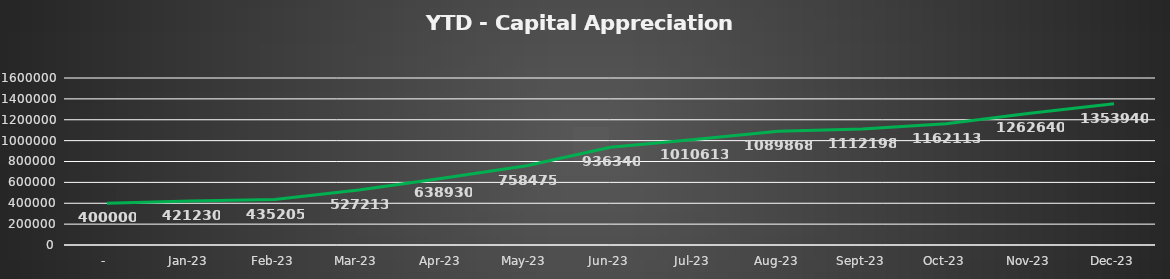
| Category | Capital Appreciation |
|---|---|
| - | 400000 |
| Jan-23 | 421230 |
| Feb-23 | 435205 |
| Mar-23 | 527212.5 |
| Apr-23 | 638930 |
| May-23 | 758475 |
| Jun-23 | 936340 |
| Jul-23 | 1010612.5 |
| Aug-23 | 1089867.5 |
| Sep-23 | 1112197.7 |
| Oct-23 | 1162112.7 |
| Nov-23 | 1262640.2 |
| Dec-23 | 1353940.2 |